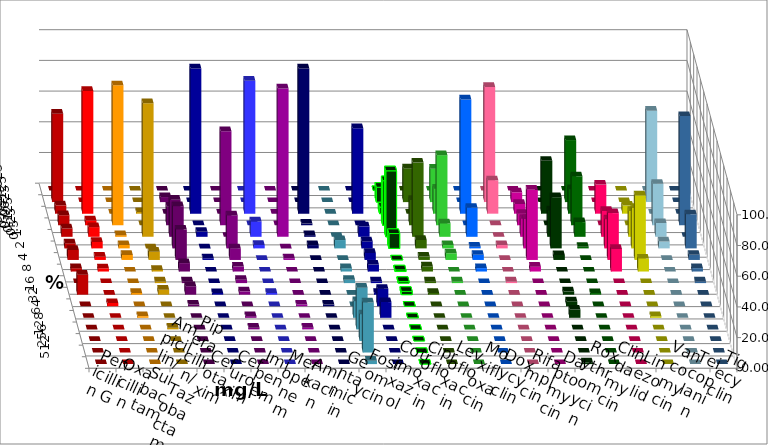
| Category | Penicillin G | Oxacillin | Ampicillin/ Sulbactam | Piperacillin/ Tazobactam | Cefotaxim | Cefuroxim | Imipenem | Meropenem | Amikacin | Gentamicin | Fosfomycin | Cotrimoxazol | Ciprofloxacin | Levofloxacin | Moxifloxacin | Doxycyclin | Rifampicin | Daptomycin | Roxythromycin | Clindamycin | Linezolid | Vancomycin | Teicoplanin | Tigecyclin |
|---|---|---|---|---|---|---|---|---|---|---|---|---|---|---|---|---|---|---|---|---|---|---|---|---|
| 0.015625 | 0 | 0 | 0 | 0 | 0 | 0 | 0 | 0 | 0 | 0 | 0 | 0 | 0 | 0 | 0 | 0 | 0 | 0 | 0 | 0 | 0 | 0 | 0 | 0 |
| 0.03125 | 57.609 | 0 | 0 | 0 | 3.297 | 0 | 0 | 0 | 0 | 0 | 0 | 0 | 9.677 | 21.978 | 21.739 | 0 | 75 | 6.383 | 0 | 40.426 | 0 | 0 | 0 | 59.551 |
| 0.0625 | 5.435 | 80 | 0 | 1.075 | 0 | 0 | 94.624 | 86.667 | 0 | 94.624 | 0 | 55.682 | 4.301 | 0 | 16.304 | 74.444 | 21.739 | 6.383 | 34.409 | 15.957 | 18.947 | 5.263 | 0 | 0 |
| 0.125 | 6.522 | 3.158 | 91.209 | 0 | 12.088 | 61.29 | 0 | 0 | 0 | 1.075 | 0 | 0 | 29.032 | 16.484 | 45.652 | 0 | 0 | 7.447 | 0 | 31.915 | 0 | 0 | 71.111 | 26.966 |
| 0.25 | 5.435 | 6.316 | 1.099 | 87.097 | 24.176 | 0 | 3.226 | 10 | 96.667 | 1.075 | 0 | 6.818 | 43.011 | 48.352 | 8.696 | 18.889 | 0 | 11.702 | 17.204 | 9.574 | 16.842 | 16.842 | 0 | 8.989 |
| 0.5 | 3.261 | 4.211 | 2.198 | 0 | 27.473 | 21.505 | 0 | 2.222 | 0 | 2.151 | 5.435 | 4.545 | 9.677 | 5.495 | 2.174 | 1.111 | 2.174 | 19.149 | 33.333 | 1.064 | 18.947 | 26.316 | 22.222 | 4.494 |
| 1.0 | 6.522 | 2.105 | 3.297 | 5.376 | 19.78 | 7.527 | 1.075 | 0 | 1.111 | 0 | 0 | 4.545 | 0 | 2.198 | 4.348 | 3.333 | 0 | 45.745 | 3.226 | 0 | 30.526 | 42.105 | 3.333 | 0 |
| 2.0 | 2.174 | 2.105 | 0 | 1.075 | 5.495 | 3.226 | 0 | 0 | 0 | 0 | 2.174 | 4.545 | 1.075 | 3.297 | 0 | 2.222 | 0 | 3.191 | 0 | 0 | 14.737 | 8.421 | 2.222 | 0 |
| 4.0 | 0 | 0 | 0 | 1.075 | 1.099 | 2.151 | 0 | 0 | 0 | 0 | 2.174 | 1.136 | 1.075 | 1.099 | 1.087 | 0 | 1.087 | 0 | 0 | 0 | 0 | 0 | 1.111 | 0 |
| 8.0 | 13.043 | 0 | 1.099 | 3.226 | 5.495 | 2.151 | 1.075 | 1.111 | 0 | 0 | 0 | 1.136 | 2.151 | 1.099 | 0 | 0 | 0 | 0 | 2.151 | 1.064 | 0 | 0 | 0 | 0 |
| 16.0 | 0 | 2.105 | 0 | 0 | 1.099 | 0 | 0 | 0 | 1.111 | 1.075 | 0 | 11.364 | 0 | 0 | 0 | 0 | 0 | 0 | 3.226 | 0 | 0 | 0 | 0 | 0 |
| 32.0 | 0 | 0 | 1.099 | 0 | 0 | 1.075 | 0 | 0 | 0 | 0 | 10.87 | 10.227 | 0 | 0 | 0 | 0 | 0 | 0 | 5.376 | 0 | 0 | 1.053 | 0 | 0 |
| 64.0 | 0 | 0 | 0 | 1.075 | 0 | 1.075 | 0 | 0 | 1.111 | 0 | 27.174 | 0 | 0 | 0 | 0 | 0 | 0 | 0 | 0 | 0 | 0 | 0 | 0 | 0 |
| 128.0 | 0 | 0 | 0 | 0 | 0 | 0 | 0 | 0 | 0 | 0 | 17.391 | 0 | 0 | 0 | 0 | 0 | 0 | 0 | 0 | 0 | 0 | 0 | 0 | 0 |
| 256.0 | 0 | 0 | 0 | 0 | 0 | 0 | 0 | 0 | 0 | 0 | 32.609 | 0 | 0 | 0 | 0 | 0 | 0 | 0 | 0 | 0 | 0 | 0 | 0 | 0 |
| 512.0 | 0 | 0 | 0 | 0 | 0 | 0 | 0 | 0 | 0 | 0 | 2.174 | 0 | 0 | 0 | 0 | 0 | 0 | 0 | 1.075 | 0 | 0 | 0 | 0 | 0 |